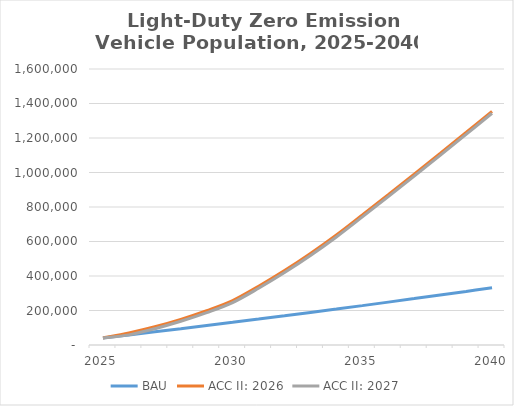
| Category | BAU | ACC II: 2026 | ACC II: 2027 |
|---|---|---|---|
| 2025.0 | 40825.646 | 40825.646 | 40825.646 |
| 2026.0 | 58618.114 | 69790.128 | 58618.114 |
| 2027.0 | 76582.004 | 105717.908 | 94545.893 |
| 2028.0 | 94715.145 | 148731.405 | 137559.391 |
| 2029.0 | 113015.367 | 198950.619 | 187778.604 |
| 2030.0 | 131480.499 | 257351.966 | 246179.952 |
| 2031.0 | 150242.919 | 340255.686 | 329083.672 |
| 2032.0 | 169303.604 | 431126.393 | 419954.379 |
| 2033.0 | 188663.528 | 530177.166 | 519005.152 |
| 2034.0 | 208323.666 | 637622.106 | 626450.092 |
| 2035.0 | 228284.993 | 753676.334 | 742504.319 |
| 2036.0 | 248485.881 | 871123.356 | 859951.342 |
| 2037.0 | 268926.33 | 989963.175 | 978791.16 |
| 2038.0 | 289606.339 | 1110195.789 | 1099023.774 |
| 2039.0 | 310525.91 | 1231821.198 | 1220649.184 |
| 2040.0 | 331685.041 | 1354839.403 | 1343667.389 |